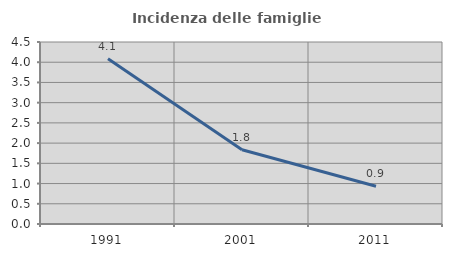
| Category | Incidenza delle famiglie numerose |
|---|---|
| 1991.0 | 4.087 |
| 2001.0 | 1.835 |
| 2011.0 | 0.934 |